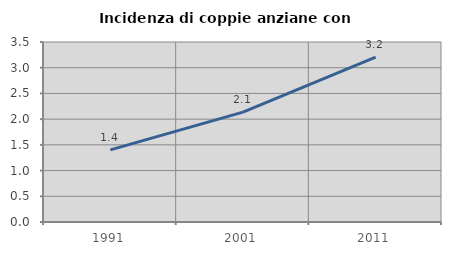
| Category | Incidenza di coppie anziane con figli |
|---|---|
| 1991.0 | 1.404 |
| 2001.0 | 2.137 |
| 2011.0 | 3.204 |